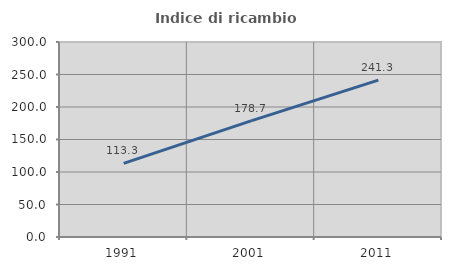
| Category | Indice di ricambio occupazionale  |
|---|---|
| 1991.0 | 113.31 |
| 2001.0 | 178.674 |
| 2011.0 | 241.27 |